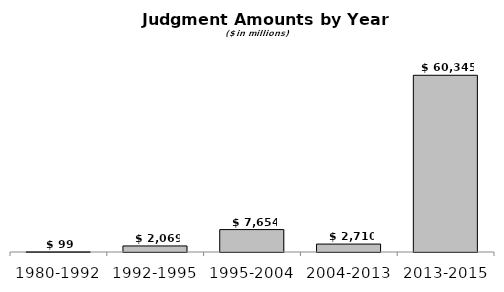
| Category | Total |
|---|---|
| 1980-1992 | 99.4 |
| 1992-1995 | 2068.5 |
| 1995-2004 | 7653.5 |
| 2004-2013 | 2709.7 |
| 2013-2015 | 60345.205 |